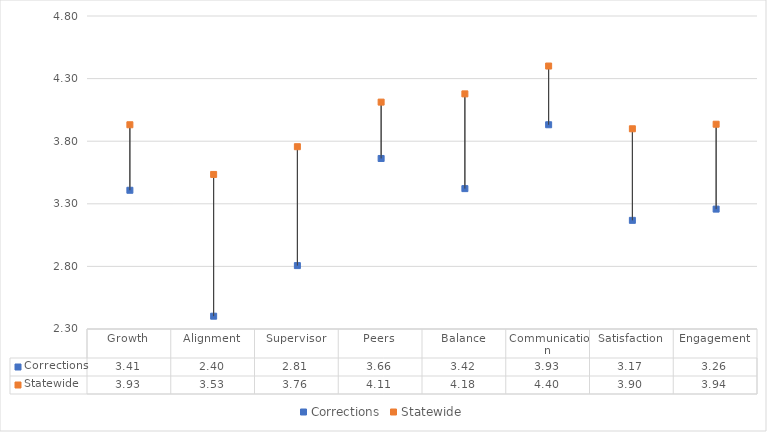
| Category | Corrections | Statewide |
|---|---|---|
| Growth | 3.408 | 3.931 |
| Alignment | 2.402 | 3.534 |
| Supervisor | 2.806 | 3.756 |
| Peers | 3.662 | 4.112 |
| Balance | 3.421 | 4.178 |
| Communication | 3.931 | 4.4 |
| Satisfaction | 3.168 | 3.899 |
| Engagement | 3.257 | 3.936 |